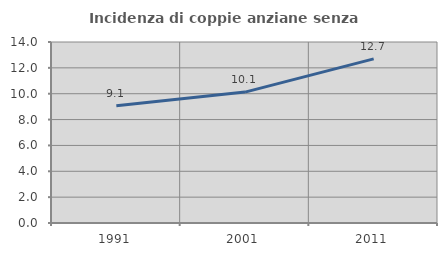
| Category | Incidenza di coppie anziane senza figli  |
|---|---|
| 1991.0 | 9.072 |
| 2001.0 | 10.125 |
| 2011.0 | 12.695 |